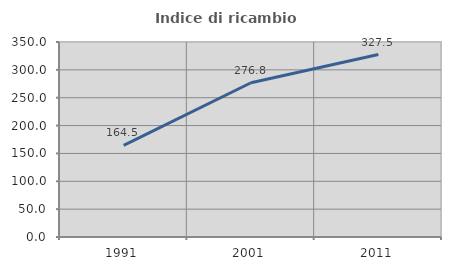
| Category | Indice di ricambio occupazionale  |
|---|---|
| 1991.0 | 164.545 |
| 2001.0 | 276.812 |
| 2011.0 | 327.473 |